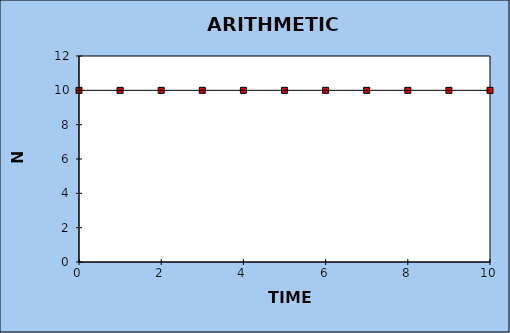
| Category | Series 0 |
|---|---|
| 0.0 | 10 |
| 1.0 | 10 |
| 2.0 | 10 |
| 3.0 | 10 |
| 4.0 | 10 |
| 5.0 | 10 |
| 6.0 | 10 |
| 7.0 | 10 |
| 8.0 | 10 |
| 9.0 | 10 |
| 10.0 | 10 |